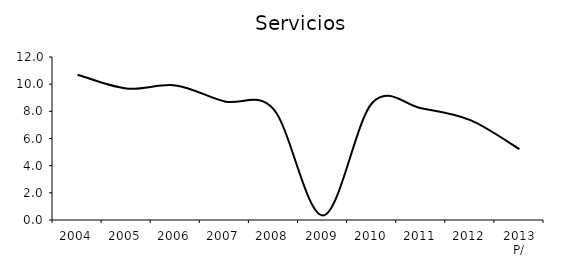
| Category | Servicios |
|---|---|
| 2004 | 10.699 |
| 2005 | 9.679 |
| 2006 | 9.908 |
| 2007 | 8.726 |
| 2008 | 8.126 |
| 2009 | 0.339 |
| 2010 | 8.616 |
| 2011 | 8.223 |
| 2012 | 7.355 |
| 2013 P/ | 5.221 |